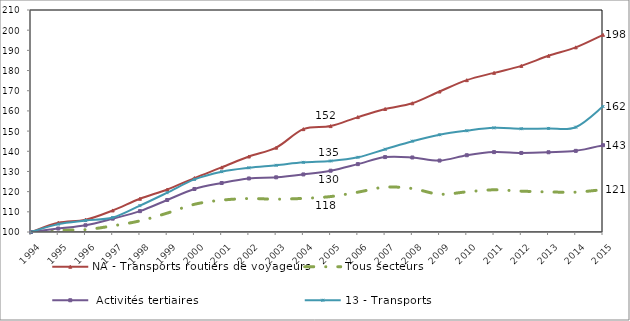
| Category | NA - Transports routiers de voyageurs | Tous secteurs |  Activités tertiaires | 13 - Transports | ligne 100 |
|---|---|---|---|---|---|
| 1994.0 | 100 | 100 | 100 | 100 | 100 |
| 1995.0 | 104.564 | 100.976 | 101.715 | 103.898 | 100 |
| 1996.0 | 106.079 | 101.173 | 103.336 | 105.655 | 100 |
| 1997.0 | 110.68 | 103.051 | 106.612 | 107.166 | 100 |
| 1998.0 | 116.488 | 105.521 | 110.333 | 113.066 | 100 |
| 1999.0 | 121.056 | 109.358 | 115.859 | 119.475 | 100 |
| 2000.0 | 126.729 | 113.726 | 121.31 | 126.073 | 100 |
| 2001.0 | 132.003 | 115.771 | 124.267 | 129.89 | 100 |
| 2002.0 | 137.415 | 116.569 | 126.525 | 131.809 | 100 |
| 2003.0 | 141.795 | 116.267 | 127.094 | 133.048 | 100 |
| 2004.0 | 150.971 | 116.656 | 128.528 | 134.502 | 100 |
| 2005.0 | 152.474 | 117.561 | 130.376 | 135.174 | 100 |
| 2006.0 | 156.939 | 119.737 | 133.632 | 137 | 100 |
| 2007.0 | 160.955 | 122.208 | 137.117 | 141 | 100 |
| 2008.0 | 163.783 | 121.534 | 136.926 | 145 | 100 |
| 2009.0 | 169.616 | 118.728 | 135.391 | 148.188 | 100 |
| 2010.0 | 175.236 | 119.898 | 138.039 | 150.175 | 100 |
| 2011.0 | 178.855 | 120.906 | 139.588 | 151.594 | 100 |
| 2012.0 | 182.292 | 120.241 | 139.17 | 151.182 | 100 |
| 2013.0 | 187.309 | 119.868 | 139.508 | 151.317 | 100 |
| 2014.0 | 191.499 | 119.744 | 140.209 | 151.928 | 100 |
| 2015.0 | 197.695 | 121.011 | 143.008 | 162.183 | 100 |